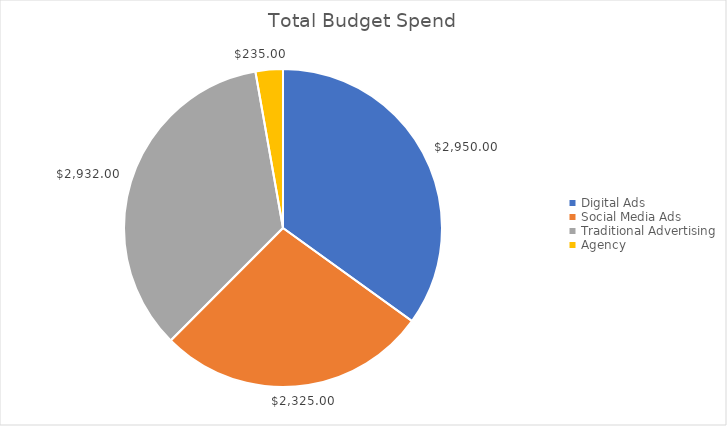
| Category | Series 0 |
|---|---|
| 0 | 2950 |
| 1 | 2325 |
| 2 | 2932 |
| 3 | 235 |